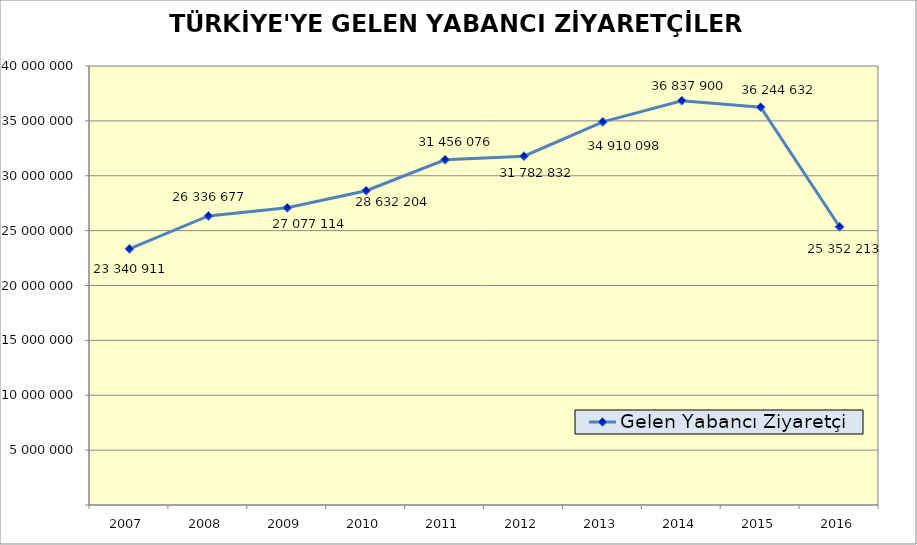
| Category | Gelen Yabancı Ziyaretçi |
|---|---|
| 2007 | 23340911 |
| 2008 | 26336677 |
| 2009 | 27077114 |
| 2010 | 28632204 |
| 2011 | 31456076 |
| 2012 | 31782832 |
| 2013 | 34910098 |
| 2014 | 36837900 |
| 2015 | 36244632 |
| 2016 | 25352213 |